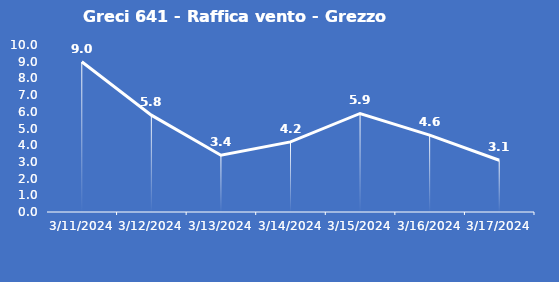
| Category | Greci 641 - Raffica vento - Grezzo (m/s) |
|---|---|
| 3/11/24 | 9 |
| 3/12/24 | 5.8 |
| 3/13/24 | 3.4 |
| 3/14/24 | 4.2 |
| 3/15/24 | 5.9 |
| 3/16/24 | 4.6 |
| 3/17/24 | 3.1 |